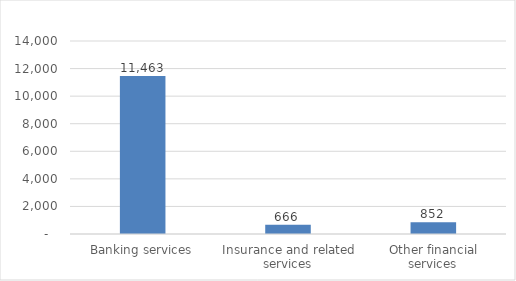
| Category |  Employees |
|---|---|
| Banking services | 11463.1 |
| Insurance and related services | 666 |
| Other financial services | 852.1 |